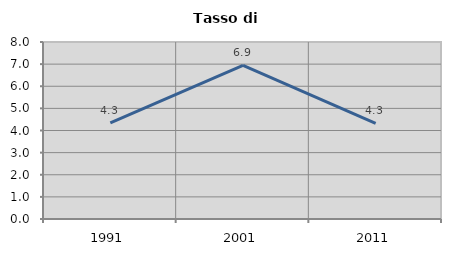
| Category | Tasso di disoccupazione   |
|---|---|
| 1991.0 | 4.348 |
| 2001.0 | 6.944 |
| 2011.0 | 4.327 |